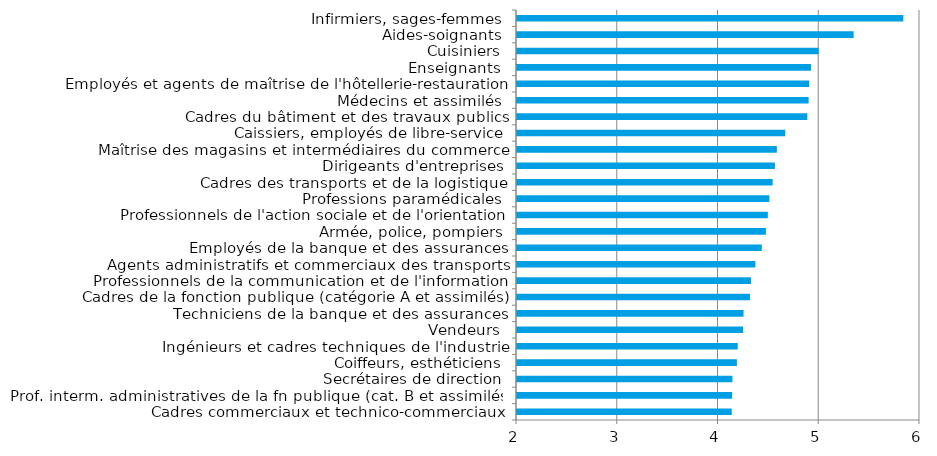
| Category | Series 0 |
|---|---|
| Cadres commerciaux et technico-commerciaux | 4.131 |
| Prof. interm. administratives de la fn publique (cat. B et assimilés) | 4.136 |
| Secrétaires de direction | 4.138 |
| Coiffeurs, esthéticiens | 4.183 |
| Ingénieurs et cadres techniques de l'industrie | 4.191 |
| Vendeurs | 4.244 |
| Techniciens de la banque et des assurances | 4.248 |
| Cadres de la fonction publique (catégorie A et assimilés) | 4.312 |
| Professionnels de la communication et de l'information | 4.322 |
| Agents administratifs et commerciaux des transports | 4.366 |
| Employés de la banque et des assurances | 4.429 |
| Armée, police, pompiers | 4.47 |
| Professionnels de l'action sociale et de l'orientation | 4.49 |
| Professions paramédicales | 4.505 |
| Cadres des transports et de la logistique | 4.538 |
| Dirigeants d'entreprises | 4.56 |
| Maîtrise des magasins et intermédiaires du commerce | 4.579 |
| Caissiers, employés de libre-service | 4.662 |
| Cadres du bâtiment et des travaux publics | 4.882 |
| Médecins et assimilés | 4.894 |
| Employés et agents de maîtrise de l'hôtellerie-restauration | 4.9 |
| Enseignants | 4.918 |
| Cuisiniers | 4.993 |
| Aides-soignants | 5.342 |
| Infirmiers, sages-femmes | 5.834 |